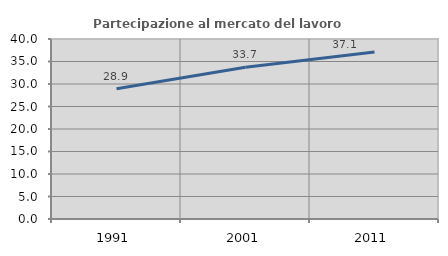
| Category | Partecipazione al mercato del lavoro  femminile |
|---|---|
| 1991.0 | 28.931 |
| 2001.0 | 33.74 |
| 2011.0 | 37.117 |